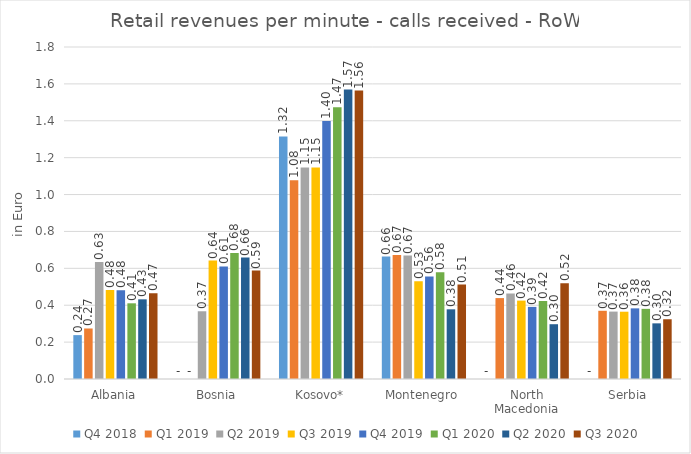
| Category | Q4 2018 | Q1 2019 | Q2 2019 | Q3 2019 | Q4 2019 | Q1 2020 | Q2 2020 | Q3 2020 |
|---|---|---|---|---|---|---|---|---|
| Albania | 0.238 | 0.274 | 0.634 | 0.482 | 0.481 | 0.41 | 0.432 | 0.465 |
| Bosnia | 0 | 0 | 0.367 | 0.642 | 0.611 | 0.683 | 0.659 | 0.588 |
| Kosovo* | 1.315 | 1.078 | 1.147 | 1.147 | 1.399 | 1.474 | 1.569 | 1.564 |
| Montenegro | 0.664 | 0.672 | 0.669 | 0.53 | 0.556 | 0.579 | 0.378 | 0.512 |
| North Macedonia | 0 | 0.439 | 0.464 | 0.425 | 0.391 | 0.423 | 0.297 | 0.518 |
| Serbia | 0 | 0.37 | 0.365 | 0.365 | 0.383 | 0.38 | 0.302 | 0.324 |